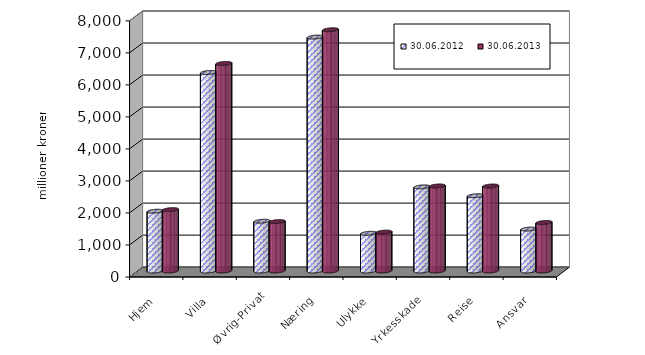
| Category | 30.06.2012 | 30.06.2013 |
|---|---|---|
| Hjem | 1867.513 | 1916.901 |
| Villa | 6202.232 | 6482.651 |
| Øvrig-Privat | 1554.837 | 1543.726 |
| Næring | 7305.699 | 7534.692 |
| Ulykke | 1177.979 | 1214.228 |
| Yrkesskade | 2627.864 | 2656.134 |
| Reise | 2350.744 | 2654.257 |
| Ansvar | 1308.439 | 1515.258 |